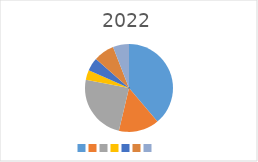
| Category | Series 0 |
|---|---|
|  | 957160 |
|  | 366349 |
|  | 600000 |
|  | 87800 |
|  | 120000 |
|  | 187645 |
|  | 145600 |